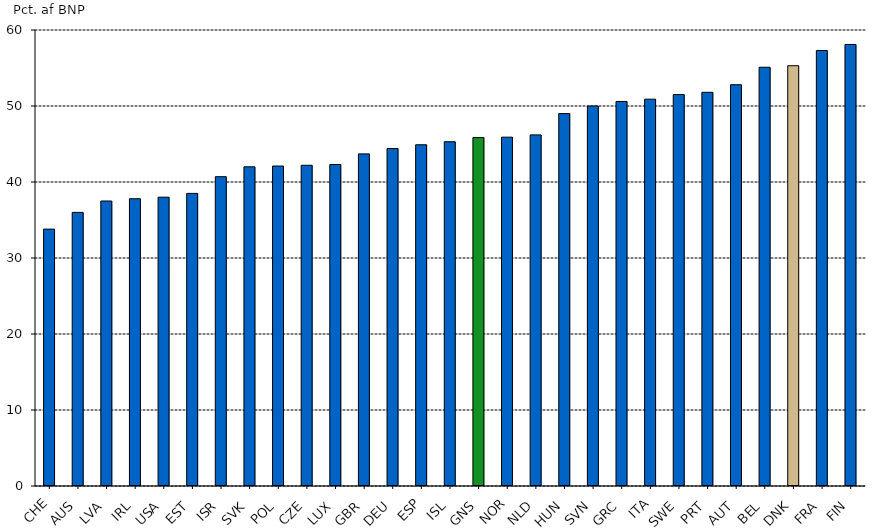
| Category | Series 0 |
|---|---|
| CHE | 33.8 |
| AUS | 36 |
| LVA | 37.5 |
| IRL | 37.8 |
| USA | 38 |
| EST | 38.5 |
| ISR | 40.7 |
| SVK | 42 |
| POL | 42.1 |
| CZE | 42.2 |
| LUX | 42.3 |
| GBR | 43.7 |
| DEU | 44.4 |
| ESP | 44.9 |
| ISL | 45.3 |
| GNS | 45.846 |
| NOR | 45.9 |
| NLD | 46.2 |
| HUN | 49 |
| SVN | 50 |
| GRC | 50.6 |
| ITA | 50.9 |
| SWE | 51.5 |
| PRT | 51.8 |
| AUT | 52.8 |
| BEL | 55.1 |
| DNK | 55.3 |
| FRA | 57.3 |
| FIN | 58.1 |